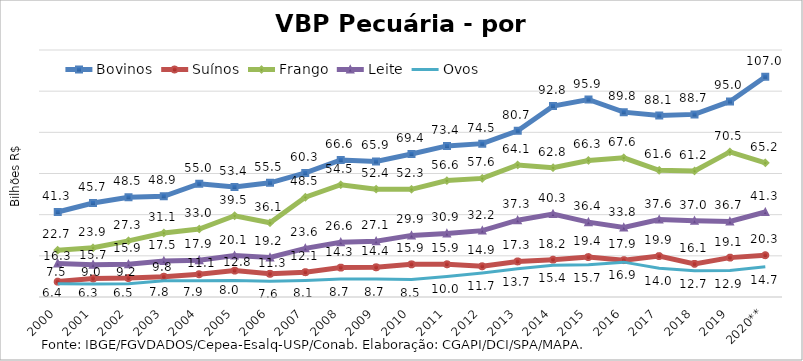
| Category | Bovinos | Suínos | Frango | Leite | Ovos |
|---|---|---|---|---|---|
| 2000 | 41.314 | 7.481 | 22.733 | 16.319 | 6.38 |
| 2001 | 45.669 | 8.975 | 23.894 | 15.703 | 6.287 |
| 2002 | 48.463 | 9.198 | 27.275 | 15.901 | 6.478 |
| 2003 | 48.912 | 9.83 | 31.095 | 17.51 | 7.836 |
| 2004 | 55.032 | 11.053 | 33.019 | 17.896 | 7.942 |
| 2005 | 53.428 | 12.814 | 39.476 | 20.128 | 7.996 |
| 2006 | 55.471 | 11.272 | 36.064 | 19.226 | 7.595 |
| 2007 | 60.285 | 12.053 | 48.455 | 23.635 | 8.072 |
| 2008 | 66.561 | 14.272 | 54.545 | 26.588 | 8.717 |
| 2009 | 65.867 | 14.427 | 52.37 | 27.107 | 8.692 |
| 2010 | 69.444 | 15.871 | 52.307 | 29.936 | 8.454 |
| 2011 | 73.413 | 15.896 | 56.573 | 30.86 | 9.962 |
| 2012 | 74.507 | 14.926 | 57.629 | 32.248 | 11.677 |
| 2013 | 80.739 | 17.282 | 64.141 | 37.317 | 13.734 |
| 2014 | 92.755 | 18.152 | 62.844 | 40.298 | 15.431 |
| 2015 | 95.947 | 19.398 | 66.344 | 36.375 | 15.712 |
| 2016 | 89.811 | 17.902 | 67.6 | 33.752 | 16.938 |
| 2017 | 88.134 | 19.873 | 61.572 | 37.607 | 13.962 |
| 2018 | 88.725 | 16.094 | 61.236 | 37.048 | 12.696 |
| 2019 | 95.004 | 19.13 | 70.507 | 36.7 | 12.853 |
| 2020** | 107.003 | 20.31 | 65.207 | 41.288 | 14.709 |